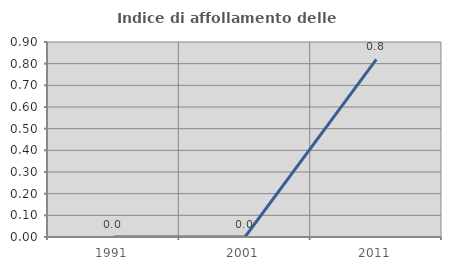
| Category | Indice di affollamento delle abitazioni  |
|---|---|
| 1991.0 | 0 |
| 2001.0 | 0 |
| 2011.0 | 0.82 |